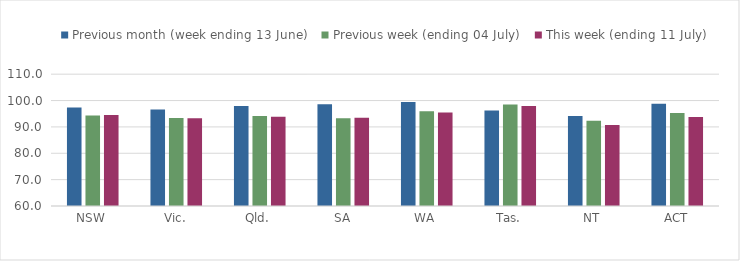
| Category | Previous month (week ending 13 June) | Previous week (ending 04 July) | This week (ending 11 July) |
|---|---|---|---|
| NSW | 97.406 | 94.309 | 94.529 |
| Vic. | 96.639 | 93.34 | 93.31 |
| Qld. | 97.975 | 94.18 | 93.873 |
| SA | 98.561 | 93.301 | 93.518 |
| WA | 99.438 | 95.912 | 95.423 |
| Tas. | 96.212 | 98.51 | 97.898 |
| NT | 94.136 | 92.324 | 90.757 |
| ACT | 98.77 | 95.321 | 93.783 |